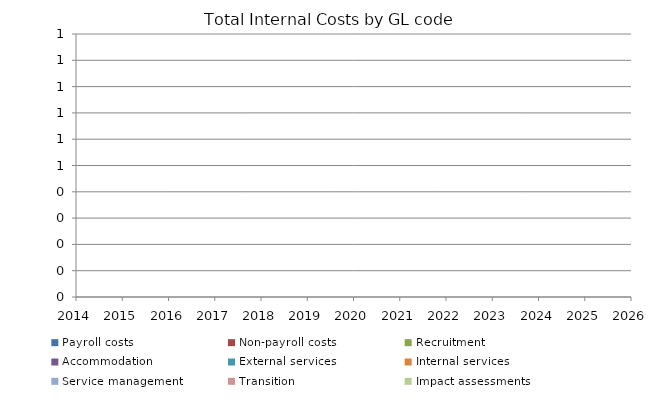
| Category | Payroll costs | Non-payroll costs | Recruitment | Accommodation | External services | Internal services | Service management | Transition | Impact assessments |
|---|---|---|---|---|---|---|---|---|---|
| 2014.0 | 0 | 0 | 0 | 0 | 0 | 0 | 0 | 0 | 0 |
| 2015.0 | 0 | 0 | 0 | 0 | 0 | 0 | 0 | 0 | 0 |
| 2016.0 | 0 | 0 | 0 | 0 | 0 | 0 | 0 | 0 | 0 |
| 2017.0 | 0 | 0 | 0 | 0 | 0 | 0 | 0 | 0 | 0 |
| 2018.0 | 0 | 0 | 0 | 0 | 0 | 0 | 0 | 0 | 0 |
| 2019.0 | 0 | 0 | 0 | 0 | 0 | 0 | 0 | 0 | 0 |
| 2020.0 | 0 | 0 | 0 | 0 | 0 | 0 | 0 | 0 | 0 |
| 2021.0 | 0 | 0 | 0 | 0 | 0 | 0 | 0 | 0 | 0 |
| 2022.0 | 0 | 0 | 0 | 0 | 0 | 0 | 0 | 0 | 0 |
| 2023.0 | 0 | 0 | 0 | 0 | 0 | 0 | 0 | 0 | 0 |
| 2024.0 | 0 | 0 | 0 | 0 | 0 | 0 | 0 | 0 | 0 |
| 2025.0 | 0 | 0 | 0 | 0 | 0 | 0 | 0 | 0 | 0 |
| 2026.0 | 0 | 0 | 0 | 0 | 0 | 0 | 0 | 0 | 0 |